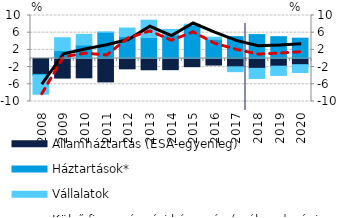
| Category | Államháztartás (ESA-egyenleg) | Háztartások* | Vállalatok |
|---|---|---|---|
| 2008.0 | -3.698 | -0.202 | -4.404 |
| 2009.0 | -4.561 | 1.816 | 3.012 |
| 2010.0 | -4.497 | 3.122 | 2.493 |
| 2011.0 | -5.441 | 6.096 | 0.059 |
| 2012.0 | -2.409 | 5.095 | 2.005 |
| 2013.0 | -2.621 | 4.863 | 4.054 |
| 2014.0 | -2.599 | 5.462 | 1.278 |
| 2015.0 | -1.906 | 7.706 | 0.273 |
| 2016.0 | -1.527 | 4.487 | 0.48 |
| 2017.0 | -1.932 | 5.083 | -1.128 |
| 2018.0 | -2.285 | 5.557 | -2.356 |
| 2019.0 | -1.788 | 5.081 | -2.147 |
| 2020.0 | -1.44 | 4.726 | -1.822 |